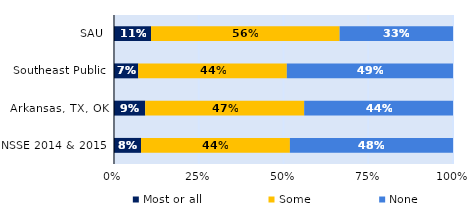
| Category | Most or all | Some | None |
|---|---|---|---|
| SAU | 0.109 | 0.556 | 0.334 |
| Southeast Public | 0.071 | 0.439 | 0.49 |
| Arkansas, TX, OK | 0.092 | 0.469 | 0.439 |
| NSSE 2014 & 2015 | 0.08 | 0.439 | 0.481 |